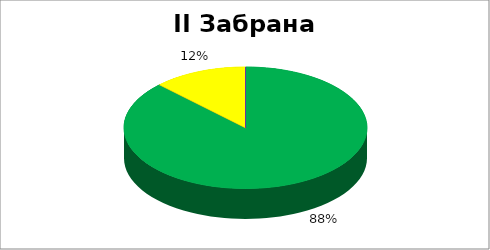
| Category | II Забрана дискриминације |
|---|---|
| 0 | 0.875 |
| 1 | 0 |
| 2 | 0.125 |
| 3 | 0 |
| 4 | 0 |